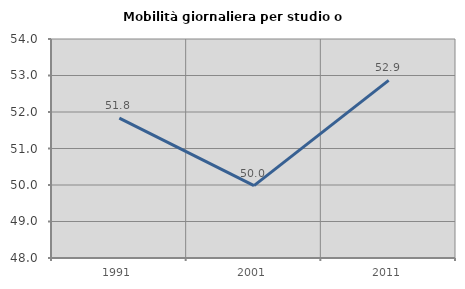
| Category | Mobilità giornaliera per studio o lavoro |
|---|---|
| 1991.0 | 51.833 |
| 2001.0 | 49.983 |
| 2011.0 | 52.868 |